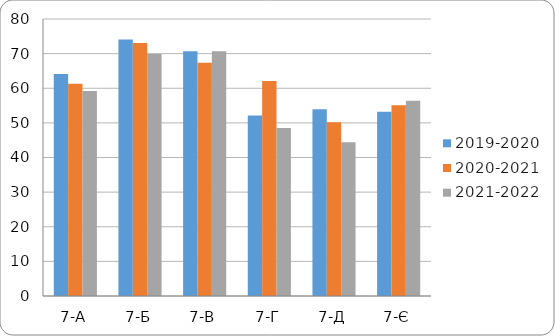
| Category | 2019-2020 | 2020-2021 | 2021-2022 |
|---|---|---|---|
| 7-А | 64.1 | 61.3 | 59.2 |
| 7-Б | 74.1 | 73.1 | 69.9 |
| 7-В | 70.7 | 67.4 | 70.7 |
| 7-Г | 52.1 | 62.1 | 48.5 |
| 7-Д | 53.9 | 50.2 | 44.4 |
| 7-Є | 53.2 | 55.1 | 56.4 |